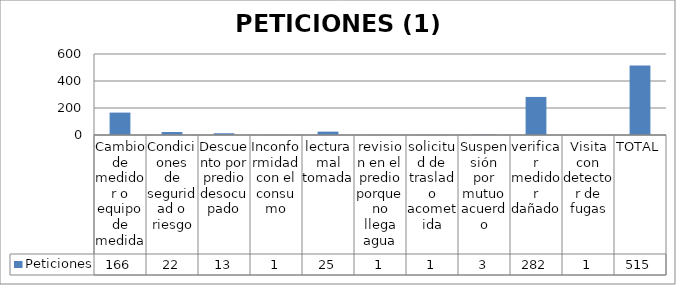
| Category | Peticiones |
|---|---|
| Cambio de medidor o equipo de medida | 166 |
| Condiciones de seguridad o riesgo | 22 |
| Descuento por predio desocupado | 13 |
| Inconformidad con el consumo | 1 |
| lectura mal tomada | 25 |
| revision en el predio porque no llega agua | 1 |
| solicitud de traslado acometida | 1 |
| Suspensión por mutuo acuerdo | 3 |
| verificar medidor dañado | 282 |
| Visita con detector de fugas | 1 |
| TOTAL | 515 |